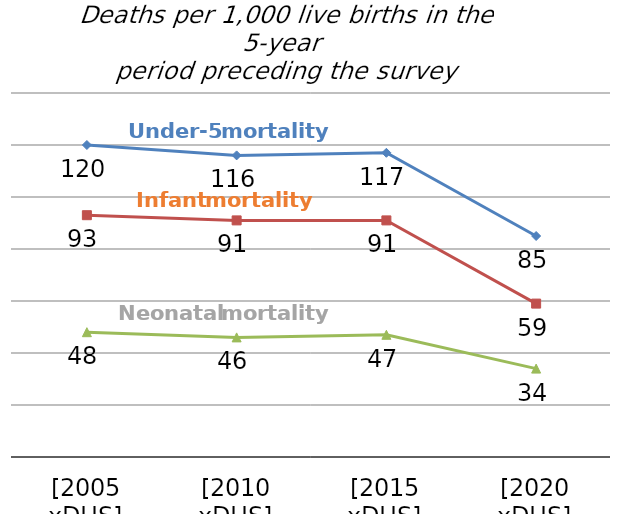
| Category | Under-five mortality | Infant mortality | Neonatal mortality |
|---|---|---|---|
| [2005 xDHS] | 120 | 93 | 48 |
| [2010 xDHS] | 116 | 91 | 46 |
| [2015 xDHS] | 117 | 91 | 47 |
| [2020 xDHS] | 85 | 59 | 34 |